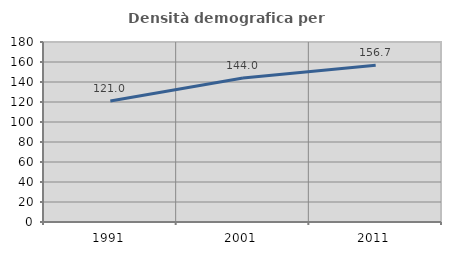
| Category | Densità demografica |
|---|---|
| 1991.0 | 120.959 |
| 2001.0 | 143.967 |
| 2011.0 | 156.723 |